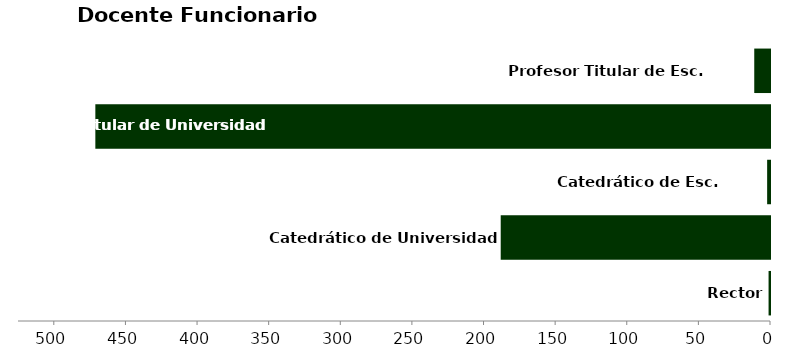
| Category | Series 3 |
|---|---|
| Rector | 1 |
| Catedrático de Universidad | 188 |
| Catedrático de Esc. Universitaria | 2 |
| Profesor Titular de Universidad | 471 |
| Profesor Titular de Esc. Universitaria | 11 |